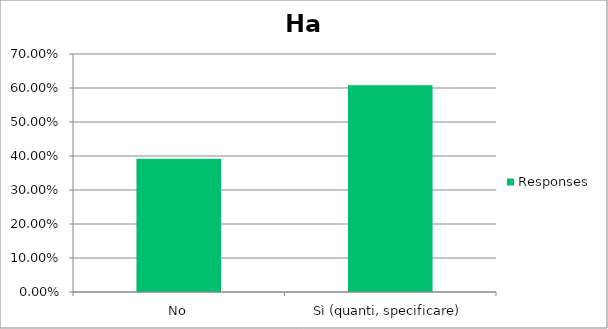
| Category | Responses |
|---|---|
| No | 0.392 |
| Sì (quanti, specificare) | 0.608 |